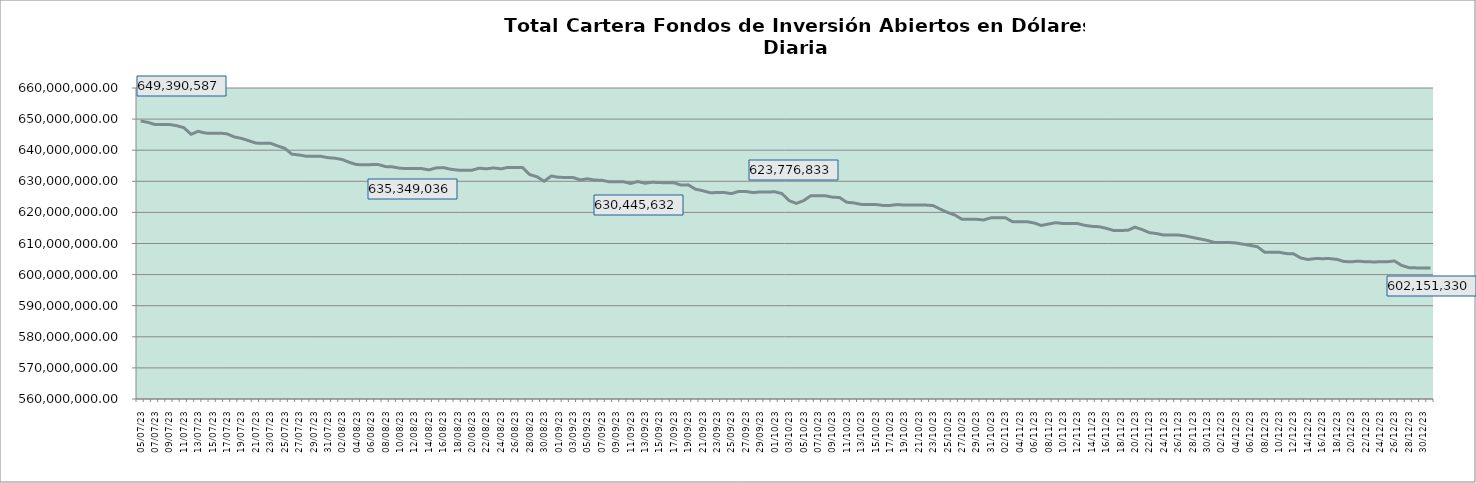
| Category | Cartera |
|---|---|
| 2023-07-05 | 649390586.51 |
| 2023-07-06 | 648958119.66 |
| 2023-07-07 | 648246143.21 |
| 2023-07-08 | 648258157.07 |
| 2023-07-09 | 648271787.22 |
| 2023-07-10 | 647891866.16 |
| 2023-07-11 | 647245078.74 |
| 2023-07-12 | 645116660.69 |
| 2023-07-13 | 646078884.58 |
| 2023-07-14 | 645494398.79 |
| 2023-07-15 | 645466947.51 |
| 2023-07-16 | 645481222.98 |
| 2023-07-17 | 645259542.67 |
| 2023-07-18 | 644264296.56 |
| 2023-07-19 | 643799384.04 |
| 2023-07-20 | 643069024.26 |
| 2023-07-21 | 642278452.17 |
| 2023-07-22 | 642244123.61 |
| 2023-07-23 | 642258415.56 |
| 2023-07-24 | 641376143.46 |
| 2023-07-25 | 640614243.11 |
| 2023-07-26 | 638711432.53 |
| 2023-07-27 | 638469597.79 |
| 2023-07-28 | 638054367.13 |
| 2023-07-29 | 638026582.46 |
| 2023-07-30 | 638040570.4 |
| 2023-07-31 | 637599680.84 |
| 2023-08-01 | 637415765.15 |
| 2023-08-02 | 636992491.84 |
| 2023-08-03 | 636062326.36 |
| 2023-08-04 | 635366651.34 |
| 2023-08-05 | 635349036.46 |
| 2023-08-06 | 635361215.21 |
| 2023-08-07 | 635373397.99 |
| 2023-08-08 | 634725343.62 |
| 2023-08-09 | 634632191.17 |
| 2023-08-10 | 634198109.24 |
| 2023-08-11 | 634095578.51 |
| 2023-08-12 | 634084871.56 |
| 2023-08-13 | 634097754.61 |
| 2023-08-14 | 633660644.19 |
| 2023-08-15 | 634304579.71 |
| 2023-08-16 | 634411668.12 |
| 2023-08-17 | 633881462.91 |
| 2023-08-18 | 633598179.77 |
| 2023-08-19 | 633555008.39 |
| 2023-08-20 | 633569125.41 |
| 2023-08-21 | 634229115.27 |
| 2023-08-22 | 634008638.11 |
| 2023-08-23 | 634293770.16 |
| 2023-08-24 | 633997015.41 |
| 2023-08-25 | 634473548.38 |
| 2023-08-26 | 634403213.36 |
| 2023-08-27 | 634418246.72 |
| 2023-08-28 | 632165453.37 |
| 2023-08-29 | 631470956.36 |
| 2023-08-30 | 630024053.72 |
| 2023-08-31 | 631709657.36 |
| 2023-09-01 | 631281911.31 |
| 2023-09-02 | 631239874.72 |
| 2023-09-03 | 631241152.77 |
| 2023-09-04 | 630445632.35 |
| 2023-09-05 | 630803968.53 |
| 2023-09-06 | 630410162.07 |
| 2023-09-07 | 630328776.06 |
| 2023-09-08 | 629862871.91 |
| 2023-09-09 | 629834149.98 |
| 2023-09-10 | 629848710.38 |
| 2023-09-11 | 629302022.2 |
| 2023-09-12 | 629921438.88 |
| 2023-09-13 | 629369255.47 |
| 2023-09-14 | 629706943.49 |
| 2023-09-15 | 629586356.93 |
| 2023-09-16 | 629530597.95 |
| 2023-09-17 | 629546459.53 |
| 2023-09-18 | 628779780.99 |
| 2023-09-19 | 628861511.4 |
| 2023-09-20 | 627472168.54 |
| 2023-09-21 | 626981471.57 |
| 2023-09-22 | 626343530.21 |
| 2023-09-23 | 626365716.65 |
| 2023-09-24 | 626387077.26 |
| 2023-09-25 | 626035802.99 |
| 2023-09-26 | 626746486.02 |
| 2023-09-27 | 626727082.97 |
| 2023-09-28 | 626364911.59 |
| 2023-09-29 | 626577853.12 |
| 2023-09-30 | 626558294.54 |
| 2023-10-01 | 626630181.41 |
| 2023-10-02 | 626064064 |
| 2023-10-03 | 623776833.22 |
| 2023-10-04 | 622898490.48 |
| 2023-10-05 | 623765057.16 |
| 2023-10-06 | 625329398.49 |
| 2023-10-07 | 625357716.82 |
| 2023-10-08 | 625377076.92 |
| 2023-10-09 | 624895198.31 |
| 2023-10-10 | 624784848.21 |
| 2023-10-11 | 623258734.78 |
| 2023-10-12 | 623043383.61 |
| 2023-10-13 | 622575019.93 |
| 2023-10-14 | 622552964.89 |
| 2023-10-15 | 622558015.47 |
| 2023-10-16 | 622241454.37 |
| 2023-10-17 | 622245757.4 |
| 2023-10-18 | 622516652.22 |
| 2023-10-19 | 622353387.79 |
| 2023-10-20 | 622367994.78 |
| 2023-10-21 | 622338417.91 |
| 2023-10-22 | 622354218.29 |
| 2023-10-23 | 622185803.88 |
| 2023-10-24 | 621022062.92 |
| 2023-10-25 | 619977031.74 |
| 2023-10-26 | 619157040.59 |
| 2023-10-27 | 617769457.82 |
| 2023-10-28 | 617759539.98 |
| 2023-10-29 | 617777286.33 |
| 2023-10-30 | 617575557.56 |
| 2023-10-31 | 618250862.96 |
| 2023-11-01 | 618284254.62 |
| 2023-11-02 | 618295975.38 |
| 2023-11-03 | 617008948.58 |
| 2023-11-04 | 617012402.6 |
| 2023-11-05 | 617026032.4 |
| 2023-11-06 | 616588553.22 |
| 2023-11-07 | 615802234.9 |
| 2023-11-08 | 616245770.29 |
| 2023-11-09 | 616699385.57 |
| 2023-11-10 | 616428658.15 |
| 2023-11-11 | 616427509.43 |
| 2023-11-12 | 616441646.85 |
| 2023-11-13 | 615857000.56 |
| 2023-11-14 | 615518268.35 |
| 2023-11-15 | 615394438.58 |
| 2023-11-16 | 614891335.14 |
| 2023-11-17 | 614211343.69 |
| 2023-11-18 | 614213053.27 |
| 2023-11-19 | 614226265.49 |
| 2023-11-20 | 615260963.47 |
| 2023-11-21 | 614465100.72 |
| 2023-11-22 | 613490454.91 |
| 2023-11-23 | 613190306.71 |
| 2023-11-24 | 612707460.65 |
| 2023-11-25 | 612707964.31 |
| 2023-11-26 | 612721200.3 |
| 2023-11-27 | 612428100.64 |
| 2023-11-28 | 611950558.76 |
| 2023-11-29 | 611473435 |
| 2023-11-30 | 611009715.37 |
| 2023-12-01 | 610356615.3 |
| 2023-12-02 | 610328191.85 |
| 2023-12-03 | 610341715.72 |
| 2023-12-04 | 610172868.69 |
| 2023-12-05 | 609778742.97 |
| 2023-12-06 | 609380953.2 |
| 2023-12-07 | 608948882.46 |
| 2023-12-08 | 607178127.02 |
| 2023-12-09 | 607172032.52 |
| 2023-12-10 | 607193159.91 |
| 2023-12-11 | 606752180.93 |
| 2023-12-12 | 606678647.58 |
| 2023-12-13 | 605353047 |
| 2023-12-14 | 604857795.12 |
| 2023-12-15 | 605150551.68 |
| 2023-12-16 | 605131400.01 |
| 2023-12-17 | 605144731.96 |
| 2023-12-18 | 604908731.46 |
| 2023-12-19 | 604210080.8 |
| 2023-12-20 | 604109124.09 |
| 2023-12-21 | 604329531.01 |
| 2023-12-22 | 604116944.42 |
| 2023-12-23 | 604086319.41 |
| 2023-12-24 | 604094910.42 |
| 2023-12-25 | 604108041.63 |
| 2023-12-26 | 604396445.91 |
| 2023-12-27 | 602964873.52 |
| 2023-12-28 | 602248257.48 |
| 2023-12-29 | 602157295.01 |
| 2023-12-30 | 602137635.44 |
| 2023-12-31 | 602151330.27 |